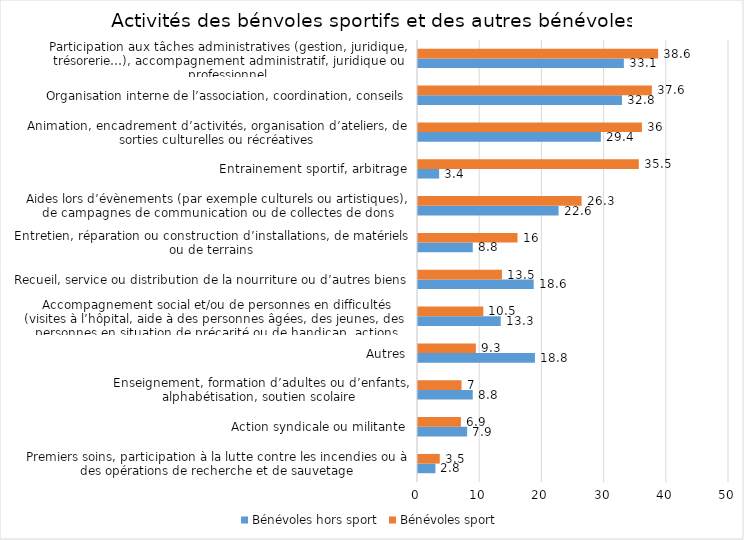
| Category | Bénévoles hors sport | Bénévoles sport |
|---|---|---|
| Premiers soins, participation à la lutte contre les incendies ou à des opérations de recherche et de sauvetage | 2.8 | 3.5 |
| Action syndicale ou militante | 7.9 | 6.9 |
| Enseignement, formation d’adultes ou d’enfants, alphabétisation, soutien scolaire | 8.8 | 7 |
| Autres | 18.8 | 9.3 |
| Accompagnement social et/ou de personnes en difficultés (visites à l’hôpital, aide à des personnes âgées, des jeunes, des personnes en situation de précarité ou de handicap, actions humanitaires...) | 13.3 | 10.5 |
| Recueil, service ou distribution de la nourriture ou d’autres biens | 18.6 | 13.5 |
| Entretien, réparation ou construction d’installations, de matériels ou de terrains | 8.8 | 16 |
| Aides lors d’évènements (par exemple culturels ou artistiques), de campagnes de communication ou de collectes de dons | 22.6 | 26.3 |
| Entrainement sportif, arbitrage | 3.4 | 35.5 |
| Animation, encadrement d’activités, organisation d’ateliers, de sorties culturelles ou récréatives | 29.4 | 36 |
| Organisation interne de l’association, coordination, conseils | 32.8 | 37.6 |
| Participation aux tâches administratives (gestion, juridique, trésorerie…), accompagnement administratif, juridique ou professionnel | 33.1 | 38.6 |